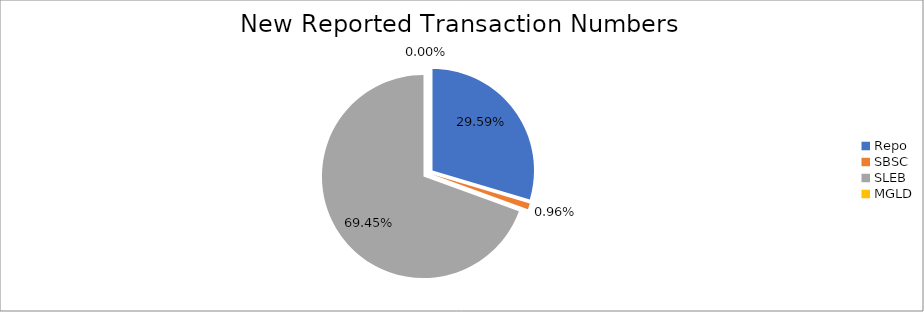
| Category | Series 0 |
|---|---|
| Repo | 286222 |
| SBSC | 9257 |
| SLEB | 671747 |
| MGLD | 15 |